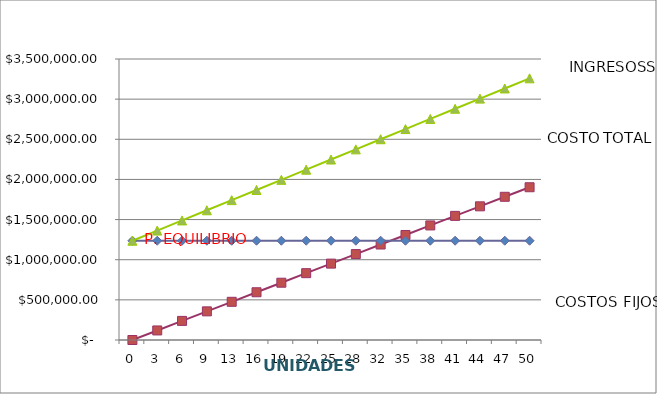
| Category | INGRESOS | COSTOS FIJOS | COSTO TOTAL |
|---|---|---|---|
| 0.0 | 0 | 1236512.551 | 1236512.551 |
| 3.1538461538461537 | 118923.077 | 1236512.551 | 1362938.439 |
| 6.3076923076923075 | 237846.154 | 1236512.551 | 1489364.328 |
| 9.461538461538462 | 356769.231 | 1236512.551 | 1615790.216 |
| 12.615384615384615 | 475692.308 | 1236512.551 | 1742216.104 |
| 15.769230769230768 | 594615.385 | 1236512.551 | 1868641.993 |
| 18.923076923076923 | 713538.462 | 1236512.551 | 1995067.881 |
| 22.076923076923077 | 832461.538 | 1236512.551 | 2121493.769 |
| 25.23076923076923 | 951384.615 | 1236512.551 | 2247919.658 |
| 28.384615384615383 | 1070307.692 | 1236512.551 | 2374345.546 |
| 31.538461538461537 | 1189230.769 | 1236512.551 | 2500771.434 |
| 34.69230769230769 | 1308153.846 | 1236512.551 | 2627197.323 |
| 37.84615384615385 | 1427076.923 | 1236512.551 | 2753623.211 |
| 41.0 | 1546000 | 1236512.551 | 2880049.099 |
| 44.15384615384615 | 1664923.077 | 1236512.551 | 3006474.988 |
| 47.30769230769231 | 1783846.154 | 1236512.551 | 3132900.876 |
| 50.46153846153846 | 1902769.231 | 1236512.551 | 3259326.764 |